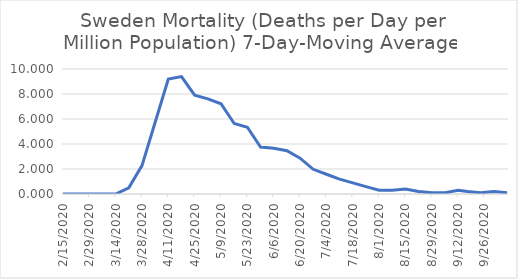
| Category | Sweden |
|---|---|
| 2/15/20 | 0 |
| 2/22/20 | 0 |
| 2/29/20 | 0 |
| 3/7/20 | 0 |
| 3/14/20 | 0 |
| 3/21/20 | 0.494 |
| 3/28/20 | 2.274 |
| 4/4/20 | 5.735 |
| 4/11/20 | 9.196 |
| 4/18/20 | 9.394 |
| 4/25/20 | 7.911 |
| 5/2/20 | 7.614 |
| 5/9/20 | 7.218 |
| 5/16/20 | 5.636 |
| 5/23/20 | 5.34 |
| 5/30/20 | 3.758 |
| 6/6/20 | 3.659 |
| 6/13/20 | 3.461 |
| 6/20/20 | 2.868 |
| 6/27/20 | 1.978 |
| 7/4/20 | 1.582 |
| 7/11/20 | 1.187 |
| 7/18/20 | 0.89 |
| 7/25/20 | 0.593 |
| 8/1/20 | 0.297 |
| 8/8/20 | 0.297 |
| 8/15/20 | 0.396 |
| 8/22/20 | 0.198 |
| 8/29/20 | 0.099 |
| 9/5/20 | 0.099 |
| 9/12/20 | 0.297 |
| 9/17/20 | 0.198 |
| 9/24/20 | 0.099 |
| 10/1/20 | 0.198 |
| 10/8/20 | 0.099 |